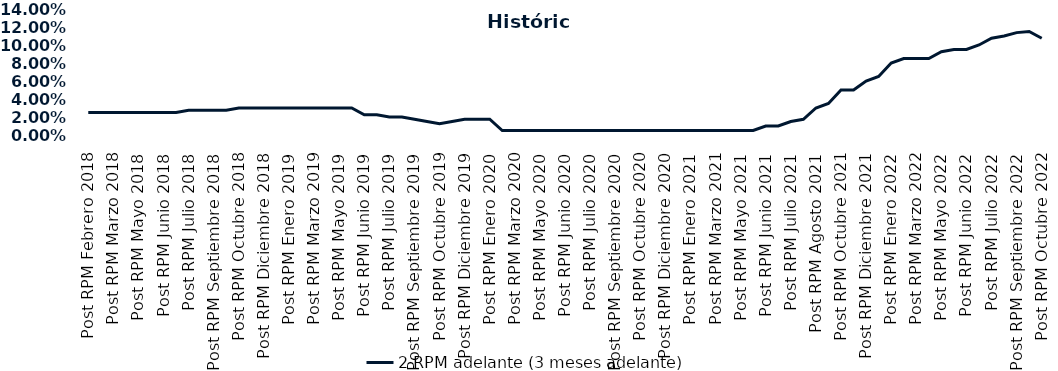
| Category | 2 RPM adelante (3 meses adelante) |
|---|---|
| Post RPM Febrero 2018 | 0.025 |
| Pre RPM Marzo 2018 | 0.025 |
| Post RPM Marzo 2018 | 0.025 |
| Pre RPM Mayo 2018 | 0.025 |
| Post RPM Mayo 2018 | 0.025 |
| Pre RPM Junio 2018 | 0.025 |
| Post RPM Junio 2018 | 0.025 |
| Pre RPM Julio 2018 | 0.025 |
| Post RPM Julio 2018 | 0.028 |
| Pre RPM Septiembre 2018 | 0.028 |
| Post RPM Septiembre 2018 | 0.028 |
| Pre RPM Octubre 2018 | 0.028 |
| Post RPM Octubre 2018 | 0.03 |
| Pre RPM Diciembre 2018 | 0.03 |
| Post RPM Diciembre 2018 | 0.03 |
| Pre RPM Enero 2019 | 0.03 |
| Post RPM Enero 2019 | 0.03 |
| Pre RPM Marzo 2019 | 0.03 |
| Post RPM Marzo 2019 | 0.03 |
| Pre RPM Mayo 2019 | 0.03 |
| Post RPM Mayo 2019 | 0.03 |
| Pre RPM Junio 2019 | 0.03 |
| Post RPM Junio 2019 | 0.022 |
| Pre RPM Julio 2019 | 0.022 |
| Post RPM Julio 2019 | 0.02 |
| Pre RPM Septiembre 2019 | 0.02 |
| Post RPM Septiembre 2019 | 0.018 |
| Pre RPM Octubre 2019 | 0.015 |
| Post RPM Octubre 2019 | 0.012 |
| Pre RPM Diciembre 2019 | 0.015 |
| Post RPM Diciembre 2019 | 0.018 |
| Pre RPM Enero 2020 | 0.018 |
| Post RPM Enero 2020 | 0.018 |
| Pre RPM Marzo 2020 | 0.005 |
| Post RPM Marzo 2020 | 0.005 |
| Pre RPM Mayo 2020 | 0.005 |
| Post RPM Mayo 2020 | 0.005 |
| Pre RPM Junio 2020 | 0.005 |
| Post RPM Junio 2020 | 0.005 |
| Pre RPM Julio 2020 | 0.005 |
| Post RPM Julio 2020 | 0.005 |
| Pre RPM Septiembre 2020 | 0.005 |
| Post RPM Septiembre 2020 | 0.005 |
| Pre RPM Octubre 2020 | 0.005 |
| Post RPM Octubre 2020 | 0.005 |
| Pre RPM Diciembre 2020 | 0.005 |
| Post RPM Diciembre 2020 | 0.005 |
| Pre RPM Enero 2021 | 0.005 |
| Post RPM Enero 2021 | 0.005 |
| Pre RPM Marzo 2021 | 0.005 |
| Post RPM Marzo 2021 | 0.005 |
| Pre RPM Mayo 2021 | 0.005 |
| Post RPM Mayo 2021 | 0.005 |
| Pre RPM Junio 2021 | 0.005 |
| Post RPM Junio 2021 | 0.01 |
| Pre RPM Julio 2021 | 0.01 |
| Post RPM Julio 2021 | 0.015 |
| Pre RPM Agosto 2021 | 0.018 |
| Post RPM Agosto 2021 | 0.03 |
| Pre RPM Octubre 2021 | 0.035 |
| Post RPM Octubre 2021 | 0.05 |
| Pre RPM Diciembre 2021 | 0.05 |
| Post RPM Diciembre 2021 | 0.06 |
| Pre RPM Enero 2022 | 0.065 |
| Post RPM Enero 2022 | 0.08 |
| Pre RPM Marzo 2022 | 0.085 |
| Post RPM Marzo 2022 | 0.085 |
| Pre RPM Mayo 2022 | 0.085 |
| Post RPM Mayo 2022 | 0.092 |
| Pre RPM Junio 2022 | 0.095 |
| Post RPM Junio 2022 | 0.095 |
| Pre RPM Julio 2022 | 0.1 |
| Post RPM Julio 2022 | 0.108 |
| Pre RPM Septiembre 2022 | 0.11 |
| Post RPM Septiembre 2022 | 0.114 |
| Pre RPM Octubre 2022 | 0.115 |
| Post RPM Octubre 2022 | 0.108 |